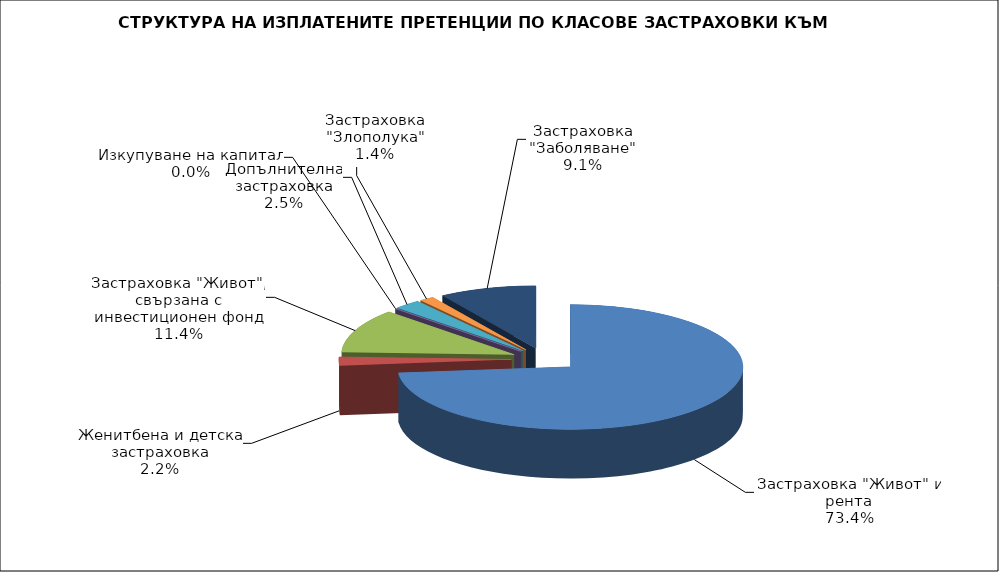
| Category | 87 753 611 |
|---|---|
| Застраховка "Живот" и рента | 87753611.328 |
| Женитбена и детска застраховка | 2625711.603 |
| Застраховка "Живот", свързана с инвестиционен фонд | 13665085.689 |
| Изкупуване на капитал | 0 |
| Допълнителна застраховка | 2989177.767 |
| Застраховка "Злополука" | 1616770.315 |
| Застраховка "Заболяване" | 10853257.666 |